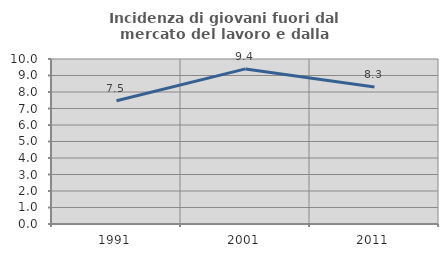
| Category | Incidenza di giovani fuori dal mercato del lavoro e dalla formazione  |
|---|---|
| 1991.0 | 7.474 |
| 2001.0 | 9.399 |
| 2011.0 | 8.308 |